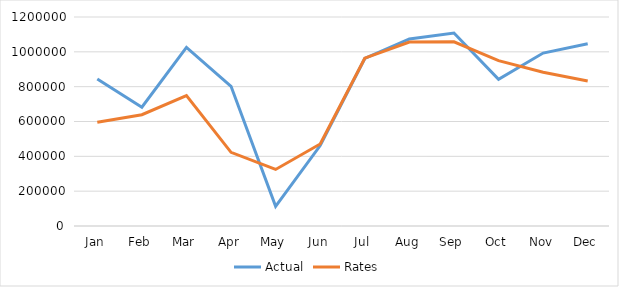
| Category | Actual | Rates |
|---|---|---|
| Jan | 844134.65 | 595510.188 |
| Feb | 682332.11 | 638819.983 |
| Mar | 1025703.112 | 749079.531 |
| Apr | 802142.754 | 423094.243 |
| May | 113276.957 | 324598.982 |
| Jun | 461894.943 | 470917.635 |
| Jul | 961795.193 | 963481.92 |
| Aug | 1073928.8 | 1056578.677 |
| Sep | 1108233.446 | 1057274.014 |
| Oct | 841701.633 | 949679.626 |
| Nov | 992910.311 | 882973.612 |
| Dec | 1046402.308 | 832985.1 |